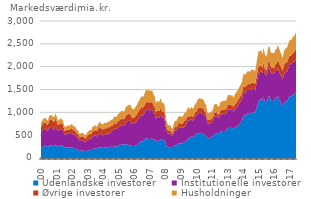
| Category | Udenlandske investorer | Institutionelle investorer | Øvrige investorer | Husholdninger |
|---|---|---|---|---|
| 00 | 217.932 | 343.993 | 120.156 | 95.751 |
| 00 | 235.951 | 353.024 | 125.065 | 96.633 |
| 00 | 255.099 | 377.613 | 132.6 | 101.274 |
| 00 | 283.57 | 355.026 | 129.533 | 96.445 |
| 00 | 285.717 | 368.469 | 131.941 | 96.761 |
| 00 | 240.275 | 348.061 | 138.78 | 91.432 |
| 00 | 248.499 | 365.786 | 135.784 | 94.094 |
| 00 | 271.533 | 402.479 | 152.591 | 102.132 |
| 00 | 279.541 | 396.36 | 155.119 | 101.941 |
| 00 | 278.909 | 401.17 | 154.937 | 105.354 |
| 00 | 259.425 | 372.982 | 174.238 | 101.647 |
| 00 | 255.41 | 363.754 | 171.894 | 98.533 |
| 01 | 300.654 | 398.717 | 175.138 | 107.512 |
| 01 | 262.552 | 383.302 | 166.993 | 102.939 |
| 01 | 252.887 | 351.118 | 124.328 | 96.279 |
| 01 | 257.005 | 344.263 | 122.759 | 98.718 |
| 01 | 275.994 | 359.106 | 134.365 | 100.757 |
| 01 | 274.706 | 353.047 | 124.204 | 99.211 |
| 01 | 269.398 | 357.292 | 116.872 | 97.069 |
| 01 | 240.81 | 327.882 | 98.108 | 88.349 |
| 01 | 224.249 | 276.461 | 90.109 | 81.151 |
| 01 | 224.221 | 293.056 | 92.023 | 84.387 |
| 01 | 230.034 | 299.498 | 93.996 | 85.481 |
| 01 | 231.467 | 299.69 | 94.344 | 86.637 |
| 02 | 224.163 | 301.154 | 95.766 | 87.303 |
| 02 | 231.63 | 314.998 | 98.07 | 90.077 |
| 02 | 240.617 | 312.31 | 99.14 | 91.441 |
| 02 | 218.78 | 294.41 | 94.519 | 88.278 |
| 02 | 220.539 | 292.066 | 97.049 | 89.224 |
| 02 | 204.685 | 284.563 | 92.019 | 85.512 |
| 02 | 189.435 | 259.363 | 84.401 | 76.987 |
| 02 | 183.16 | 261.985 | 86.17 | 79.17 |
| 02 | 155.136 | 222.071 | 76.252 | 70.598 |
| 02 | 160.534 | 227.795 | 81.436 | 71.718 |
| 02 | 169.807 | 222.684 | 83.7 | 72.514 |
| 02 | 162.632 | 227.109 | 83.613 | 73.769 |
| 03 | 154.966 | 212.61 | 80.578 | 71.074 |
| 03 | 145.506 | 202.126 | 78.707 | 69.005 |
| 03 | 153.607 | 211.7 | 83.835 | 72.993 |
| 03 | 168.888 | 236.745 | 91.34 | 80.129 |
| 03 | 170.707 | 239.039 | 97.719 | 83.114 |
| 03 | 176.89 | 252.576 | 102.967 | 88.342 |
| 03 | 175.391 | 247.216 | 96.196 | 88.715 |
| 03 | 199.335 | 281.884 | 105.43 | 98.134 |
| 03 | 199.553 | 276.855 | 106.664 | 97.925 |
| 03 | 212.228 | 296.6 | 114.342 | 104.902 |
| 03 | 205.954 | 270.83 | 111.812 | 101.447 |
| 03 | 209.167 | 269.34 | 115.474 | 103.574 |
| 04 | 227.156 | 293.434 | 126.001 | 112.167 |
| 04 | 239.311 | 308.344 | 131.99 | 116.256 |
| 04 | 225.41 | 285.913 | 132.491 | 111.78 |
| 04 | 225.729 | 279.115 | 128.832 | 111.358 |
| 04 | 218.987 | 277.747 | 126.766 | 110.906 |
| 04 | 229.04 | 292.649 | 132.934 | 117.177 |
| 04 | 228.431 | 290.789 | 131.302 | 117.354 |
| 04 | 231.592 | 286.935 | 132.83 | 118.241 |
| 04 | 240.125 | 305.812 | 139.164 | 123.685 |
| 04 | 233.781 | 293.327 | 137.198 | 121.434 |
| 04 | 245.927 | 304.575 | 146.671 | 129.148 |
| 04 | 244.187 | 353.046 | 109.775 | 130.598 |
| 05 | 237.611 | 361.454 | 113.961 | 136.782 |
| 05 | 251.877 | 386.833 | 119.367 | 142.268 |
| 05 | 259.892 | 387.087 | 120.207 | 143.866 |
| 05 | 252.67 | 374.038 | 119.17 | 140.652 |
| 05 | 258.021 | 394.009 | 146.666 | 148.433 |
| 05 | 269.161 | 403.547 | 143.655 | 159.228 |
| 05 | 276.787 | 412.073 | 142.487 | 167.128 |
| 05 | 289.427 | 425.415 | 140.309 | 168.816 |
| 05 | 300.033 | 422.513 | 145.452 | 173.866 |
| 05 | 294.142 | 405.284 | 144.534 | 167.47 |
| 05 | 298.832 | 432.805 | 129.95 | 170.849 |
| 05 | 299.519 | 490.474 | 150.508 | 186.383 |
| 06 | 306.196 | 487.643 | 149.831 | 190.757 |
| 06 | 272.054 | 539.981 | 149.718 | 192.739 |
| 06 | 281.642 | 535.238 | 158.52 | 196.619 |
| 06 | 282.312 | 503.893 | 160.216 | 205.39 |
| 06 | 263.785 | 479.323 | 143.54 | 193.193 |
| 06 | 265.106 | 476.637 | 136.793 | 191.254 |
| 06 | 265.268 | 482.127 | 138.375 | 193.493 |
| 06 | 279.521 | 494.007 | 143.375 | 201.997 |
| 06 | 288.301 | 510.963 | 148.807 | 208.524 |
| 06 | 308.528 | 532.078 | 156.416 | 212.834 |
| 06 | 332.536 | 545.409 | 164.589 | 218.157 |
| 06 | 354.93 | 554.662 | 169.296 | 226.729 |
| 07 | 364.892 | 578.111 | 176.504 | 237.598 |
| 07 | 364.332 | 564.394 | 173.292 | 230.676 |
| 07 | 381.691 | 574.15 | 173.102 | 242.007 |
| 07 | 410.313 | 601.572 | 175.508 | 255.123 |
| 07 | 435.02 | 627.401 | 180.648 | 263.972 |
| 07 | 430.421 | 615.728 | 168.499 | 253.378 |
| 07 | 420.255 | 638.641 | 174.233 | 259.796 |
| 07 | 413.529 | 625.142 | 175.125 | 257.781 |
| 07 | 419.894 | 629.427 | 169.997 | 253.278 |
| 07 | 423.677 | 634.182 | 175.701 | 255.916 |
| 07 | 404.771 | 582.202 | 164.012 | 234.447 |
| 07 | 406.71 | 557.966 | 160.271 | 227.451 |
| 08 | 360.13 | 497.441 | 144.326 | 195.568 |
| 08 | 382.425 | 518.192 | 148.255 | 204.722 |
| 08 | 370.559 | 514.814 | 144.52 | 199.311 |
| 08 | 379.087 | 515.815 | 140.982 | 202.16 |
| 08 | 414.774 | 538.92 | 148.156 | 211.13 |
| 08 | 399.103 | 508.045 | 130.517 | 192.449 |
| 08 | 387.859 | 490.744 | 128.633 | 186.572 |
| 08 | 400.175 | 493.115 | 128.876 | 186.293 |
| 08 | 327.569 | 419.804 | 108.618 | 156.952 |
| 08 | 255.287 | 335.389 | 87.749 | 128.283 |
| 08 | 239.106 | 306.479 | 77.334 | 116.632 |
| 08 | 231.318 | 294.96 | 70.181 | 108.991 |
| 09 | 244.979 | 296.264 | 70.135 | 115.999 |
| 09 | 226.407 | 276.127 | 61.817 | 105.867 |
| 09 | 216.423 | 259.137 | 60.386 | 102.984 |
| 09 | 254.55 | 305.114 | 72.992 | 123.685 |
| 09 | 278.345 | 326.905 | 79.796 | 133.688 |
| 09 | 280.207 | 316.779 | 76.366 | 133.064 |
| 09 | 296.576 | 331.125 | 82.137 | 142.379 |
| 09 | 315.227 | 351.244 | 91.478 | 156.452 |
| 09 | 325.883 | 358.206 | 82.023 | 156.987 |
| 09 | 318.452 | 350.564 | 79.659 | 150.993 |
| 09 | 319.484 | 355.134 | 78.712 | 149.926 |
| 09 | 333.493 | 320.792 | 123.886 | 156.364 |
| 10 | 352.551 | 342.139 | 130.48 | 165.175 |
| 10 | 359.95 | 340.421 | 129.343 | 164.004 |
| 10 | 392.777 | 399.783 | 92.478 | 174.074 |
| 10 | 421.266 | 417.995 | 98.236 | 183.911 |
| 10 | 440.297 | 362.659 | 92.264 | 172.562 |
| 10 | 459.152 | 368.227 | 92.088 | 170.899 |
| 10 | 471.226 | 380.375 | 90.102 | 178.861 |
| 10 | 455.903 | 356.008 | 88.945 | 168.422 |
| 10 | 487.585 | 372.816 | 92.653 | 178.123 |
| 10 | 514.187 | 400.198 | 97.114 | 182.329 |
| 10 | 517.548 | 403.588 | 98.661 | 186.167 |
| 10 | 541.049 | 434.826 | 113.454 | 198.546 |
| 11 | 538.316 | 445.046 | 112.402 | 200.34 |
| 11 | 554.829 | 446.378 | 114.906 | 200.084 |
| 11 | 545.771 | 426.917 | 114.198 | 196.299 |
| 11 | 548.746 | 431.958 | 120.551 | 198.016 |
| 11 | 532.717 | 452.353 | 92.22 | 190.657 |
| 11 | 506.865 | 422.359 | 86.226 | 177.014 |
| 11 | 497.656 | 405.139 | 88.065 | 174.459 |
| 11 | 424.997 | 350.334 | 77.723 | 152.009 |
| 11 | 418.746 | 335.488 | 77.689 | 148.544 |
| 11 | 432.398 | 323.161 | 79.581 | 153.361 |
| 11 | 448.362 | 323.222 | 81.135 | 154.507 |
| 11 | 465.395 | 328.393 | 81.053 | 154.686 |
| 12 | 481.708 | 350.614 | 88.98 | 165.329 |
| 12 | 536.636 | 379.675 | 95.605 | 180.99 |
| 12 | 527.634 | 374.005 | 90.972 | 177.596 |
| 12 | 540.75 | 378.302 | 84.877 | 181.646 |
| 12 | 520.058 | 348.365 | 80.764 | 170.595 |
| 12 | 532.933 | 349.163 | 83.247 | 171.395 |
| 12 | 580.974 | 372.509 | 89.45 | 182.512 |
| 12 | 587.215 | 366.329 | 96.575 | 184.882 |
| 12 | 592.041 | 375.089 | 98.628 | 188.505 |
| 12 | 588.954 | 366.275 | 104.48 | 186.267 |
| 12 | 592.819 | 374.449 | 100.93 | 188.93 |
| 12 | 600.721 | 377.209 | 100.589 | 192.181 |
| 13 | 655.273 | 398.213 | 105.166 | 204.258 |
| 13 | 662.555 | 407.49 | 108.052 | 208.893 |
| 13 | 653.522 | 405.413 | 110.358 | 210.299 |
| 13 | 661.244 | 396.287 | 98.683 | 210.336 |
| 13 | 659.235 | 396.134 | 103.106 | 214.588 |
| 13 | 632.287 | 380.571 | 97.949 | 205.148 |
| 13 | 670.618 | 404.255 | 104.936 | 217.775 |
| 13 | 679.084 | 415.102 | 109.673 | 219.921 |
| 13 | 695.279 | 426.279 | 119.656 | 226.555 |
| 13 | 715.679 | 440.202 | 121.878 | 233.784 |
| 13 | 750.223 | 457.468 | 117.561 | 241.539 |
| 13 | 770.953 | 474.349 | 118.771 | 244.236 |
| 14 | 813.78 | 471.514 | 121.861 | 253.1 |
| 14 | 914.446 | 502.269 | 137.187 | 274.649 |
| 14 | 932.436 | 496.393 | 139.45 | 270.933 |
| 14 | 932.818 | 500.595 | 115.821 | 272.926 |
| 14 | 951.629 | 520.84 | 120.673 | 283.724 |
| 14 | 986.529 | 515.509 | 121.861 | 282.97 |
| 14 | 980.214 | 508.745 | 124.714 | 278.978 |
| 14 | 977.678 | 517.242 | 126.768 | 278.844 |
| 14 | 1009.214 | 521.383 | 128.913 | 281.707 |
| 14 | 997.096 | 517.872 | 133.06 | 280.327 |
| 14 | 1007.644 | 502.533 | 136.082 | 278.014 |
| 14 | 989.086 | 496.41 | 136.868 | 276.122 |
| 15 | 1073.196 | 539.64 | 144.211 | 297.484 |
| 15 | 1157.317 | 587.209 | 154.951 | 313.794 |
| 15 | 1256.127 | 607.934 | 165.828 | 330.772 |
| 15 | 1263.324 | 619.499 | 120.71 | 317.034 |
| 15 | 1301.391 | 628.018 | 121.434 | 326.418 |
| 15 | 1250.277 | 599.694 | 113.704 | 308.93 |
| 15 | 1340.344 | 619.027 | 125.22 | 328.05 |
| 15 | 1248.663 | 608.873 | 114.138 | 313.406 |
| 15 | 1218.478 | 585.66 | 115.168 | 307.732 |
| 15 | 1239.905 | 587.42 | 120.765 | 312.788 |
| 15 | 1341.668 | 631.08 | 133.154 | 336.933 |
| 15 | 1348.62 | 617.098 | 135.068 | 334.237 |
| 16 | 1278.023 | 593.645 | 130.81 | 320.352 |
| 16 | 1247.483 | 595.574 | 135.223 | 314.762 |
| 16 | 1249.226 | 594.696 | 143.284 | 314.331 |
| 16 | 1267.428 | 593.686 | 115.582 | 315.069 |
| 16 | 1332.353 | 610.973 | 115.824 | 324.395 |
| 16 | 1306.717 | 591.807 | 168.03 | 311.449 |
| 16 | 1352.101 | 618.962 | 183.789 | 323.742 |
| 16 | 1273.58 | 623.489 | 186.507 | 319.792 |
| 16 | 1235.847 | 598.682 | 188.145 | 307.462 |
| 16 | 1184.909 | 601.318 | 191.386 | 296.448 |
| 16 | 1143.119 | 580.684 | 180.942 | 286.626 |
| 16 | 1198.308 | 631.256 | 200.531 | 302.764 |
| 17 | 1227.812 | 649.204 | 202.736 | 311.145 |
| 17 | 1237.274 | 645.94 | 203.754 | 313.16 |
| 17 | 1245.664 | 660.121 | 212.088 | 321.731 |
| 17 | 1315.707 | 687.393 | 188.323 | 337.571 |
| 17 | 1359.891 | 703.273 | 186.732 | 342.663 |
| 17 | 1350.849 | 700.537 | 187.975 | 339.617 |
| 17 | 1365.65 | 718.924 | 193.473 | 343.046 |
| 17 | 1393.758 | 716.776 | 204.266 | 346.509 |
| 17 | 1405.153 | 708.199 | 217.946 | 347.387 |
| 17 | 1442.125 | 728.647 | 223.539 | 356.364 |
| 17 | 1382.771 | 691.126 | 223.173 | 334.335 |